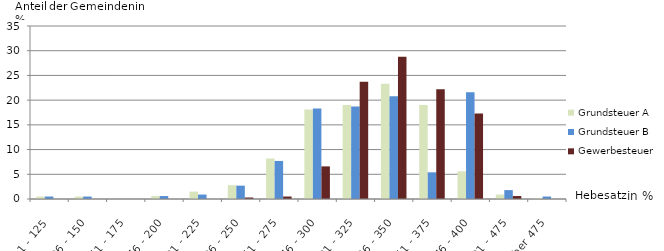
| Category | Grundsteuer A | Grundsteuer B | Gewerbesteuer |
|---|---|---|---|
| 1 - 125 | 0.5 | 0.5 | 0 |
| 126 - 150 | 0.5 | 0.5 | 0 |
| 151 - 175 | 0 | 0 | 0 |
| 176 - 200 | 0.6 | 0.6 | 0 |
| 201 - 225 | 1.5 | 0.9 | 0 |
| 226 - 250 | 2.8 | 2.7 | 0.3 |
| 251 - 275 | 8.2 | 7.7 | 0.5 |
| 276 - 300 | 18.1 | 18.3 | 6.6 |
| 301 - 325 | 19 | 18.7 | 23.7 |
| 326 - 350 | 23.3 | 20.8 | 28.8 |
| 351 - 375 | 19 | 5.4 | 22.2 |
| 376 - 400 | 5.6 | 21.6 | 17.3 |
| 401 - 475 | 0.9 | 1.8 | 0.6 |
| über 475 | 0.2 | 0.5 | 0 |